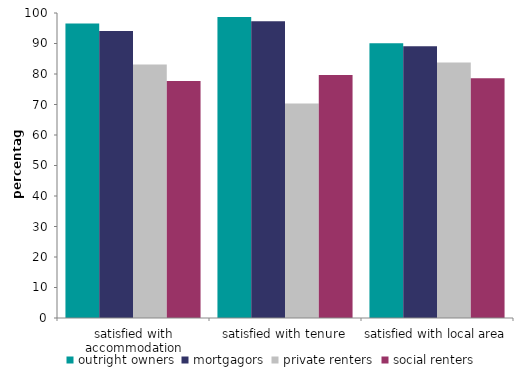
| Category | outright owners | mortgagors | private renters | social renters |
|---|---|---|---|---|
| satisfied with accommodation | 96.527 | 94.067 | 83.128 | 77.728 |
| satisfied with tenure | 98.722 | 97.285 | 70.349 | 79.69 |
| satisfied with local area | 90.07 | 89.091 | 83.734 | 78.634 |